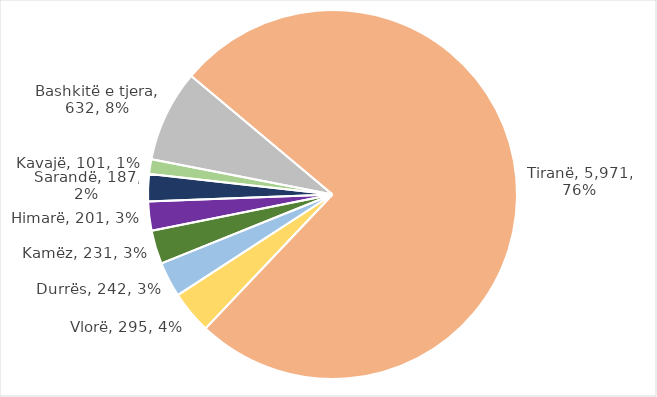
| Category | Vlera (mln lekë) | Pjesa ndaj Total 61 Bashki |
|---|---|---|
| Tiranë | 5970.839 | 0.76 |
| Vlorë | 295.021 | 0.038 |
| Durrës | 242.216 | 0.031 |
| Kamëz | 231.075 | 0.029 |
| Himarë | 200.53 | 0.026 |
| Sarandë | 187.457 | 0.024 |
| Kavajë | 101.032 | 0.013 |
| Bashkitë e tjera | 632.434 | 0.08 |